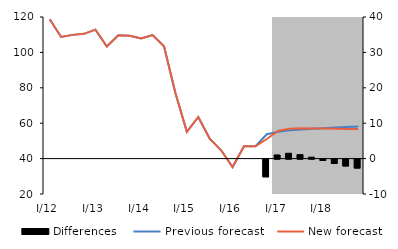
| Category | Differences |
|---|---|
| 0 | 0 |
| 1 | 0 |
| 2 | 0 |
| 3 | 0 |
| 4 | 0 |
| 5 | 0 |
| 6 | 0 |
| 7 | 0 |
| 8 | 0 |
| 9 | 0 |
| 10 | 0 |
| 11 | 0 |
| 12 | 0 |
| 13 | 0 |
| 14 | 0 |
| 15 | 0 |
| 16 | 0 |
| 17 | 0 |
| 18 | 0 |
| 19 | -5.006 |
| 20 | 1.033 |
| 21 | 1.509 |
| 22 | 1.122 |
| 23 | 0.4 |
| 24 | -0.39 |
| 25 | -1.242 |
| 26 | -1.938 |
| 27 | -2.525 |